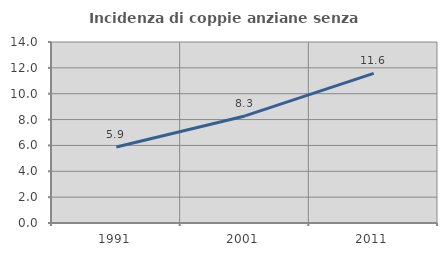
| Category | Incidenza di coppie anziane senza figli  |
|---|---|
| 1991.0 | 5.882 |
| 2001.0 | 8.282 |
| 2011.0 | 11.569 |